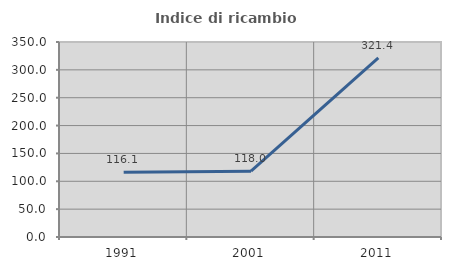
| Category | Indice di ricambio occupazionale  |
|---|---|
| 1991.0 | 116.102 |
| 2001.0 | 118.033 |
| 2011.0 | 321.429 |